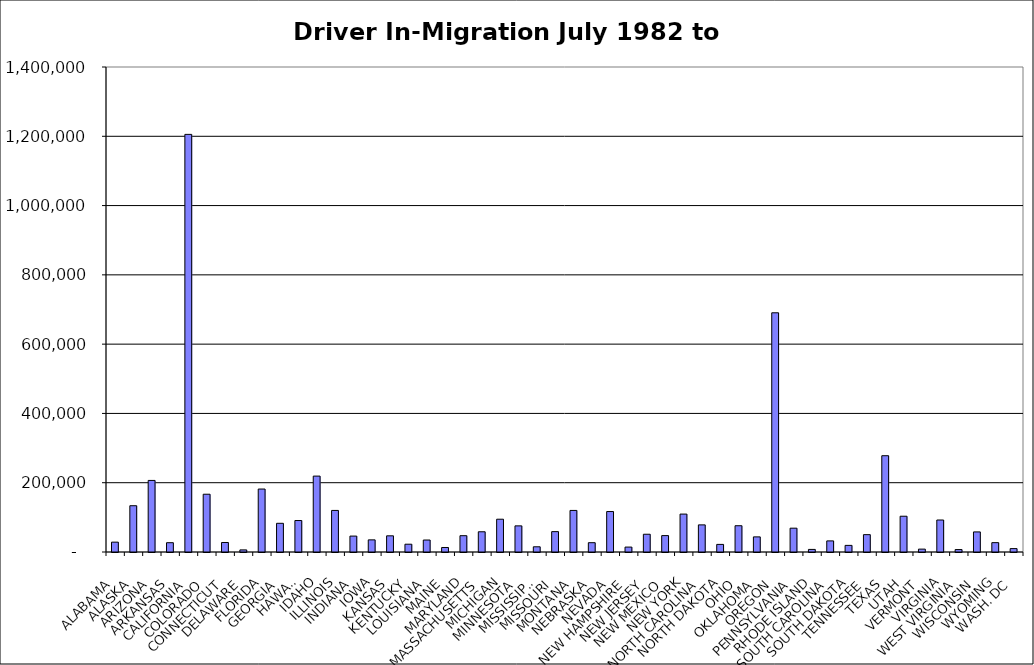
| Category | Series 0 |
|---|---|
| ALABAMA | 28442.5 |
| ALASKA | 133589.5 |
| ARIZONA | 206596 |
| ARKANSAS | 26847.5 |
| CALIFORNIA | 1205486.5 |
| COLORADO | 166781 |
| CONNECTICUT | 27448 |
| DELAWARE | 6076.5 |
| FLORIDA | 181728 |
| GEORGIA | 82844 |
| HAWAII | 90867.5 |
| IDAHO | 219077.5 |
| ILLINOIS | 120006.5 |
| INDIANA | 45947 |
| IOWA | 35038.5 |
| KANSAS | 46702.5 |
| KENTUCKY | 22474 |
| LOUISIANA | 34561.5 |
| MAINE | 13025.5 |
| MARYLAND | 47082 |
| MASSACHUSETTS | 58376 |
| MICHIGAN | 94671 |
| MINNESOTA | 75427.5 |
| MISSISSIPPI | 15029 |
| MISSOURI | 58803 |
| MONTANA | 120005 |
| NEBRASKA | 26856.5 |
| NEVADA | 116779 |
| NEW HAMPSHIRE | 14170.5 |
| NEW JERSEY | 51248 |
| NEW MEXICO | 47351 |
| NEW YORK | 109463 |
| NORTH CAROLINA | 78291.5 |
| NORTH DAKOTA | 21955.5 |
| OHIO | 75846.5 |
| OKLAHOMA | 43649 |
| OREGON | 690493 |
| PENNSYLVANIA | 68770.5 |
| RHODE ISLAND | 7461 |
| SOUTH CAROLINA | 32023.5 |
| SOUTH DAKOTA | 19092.5 |
| TENNESSEE | 50087.5 |
| TEXAS | 277933 |
| UTAH | 103280.5 |
| VERMONT | 8312 |
| VIRGINIA | 92352 |
| WEST VIRGINIA | 7029.5 |
| WISCONSIN | 57972.5 |
| WYOMING | 26994 |
| WASH. DC | 9819 |